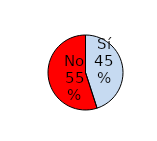
| Category | Series 1 |
|---|---|
| Sí | 302 |
| No | 369 |